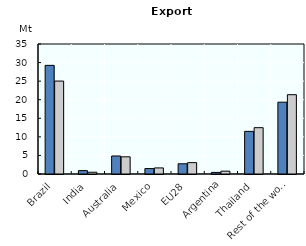
| Category | Baseline | Scenario |
|---|---|---|
| Brazil | 29.248 | 25.024 |
| India | 0.914 | 0.479 |
| Australia | 4.854 | 4.625 |
| Mexico | 1.459 | 1.637 |
| EU28 | 2.754 | 3.06 |
| Argentina | 0.428 | 0.762 |
| Thailand | 11.472 | 12.472 |
| Rest of the world | 19.332 | 21.351 |